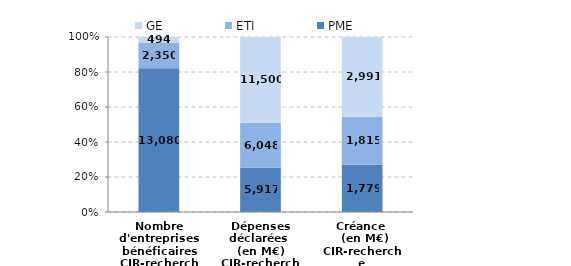
| Category | PME | ETI | GE |
|---|---|---|---|
| Nombre d'entreprises bénéficaires
CIR-recherche | 13080 | 2350 | 494 |
| Dépenses déclarées 
(en M€)
CIR-recherche | 5916.99 | 6047.52 | 11500.24 |
| Créance 
 (en M€)
CIR-recherche | 1779.02 | 1815.23 | 2991.21 |